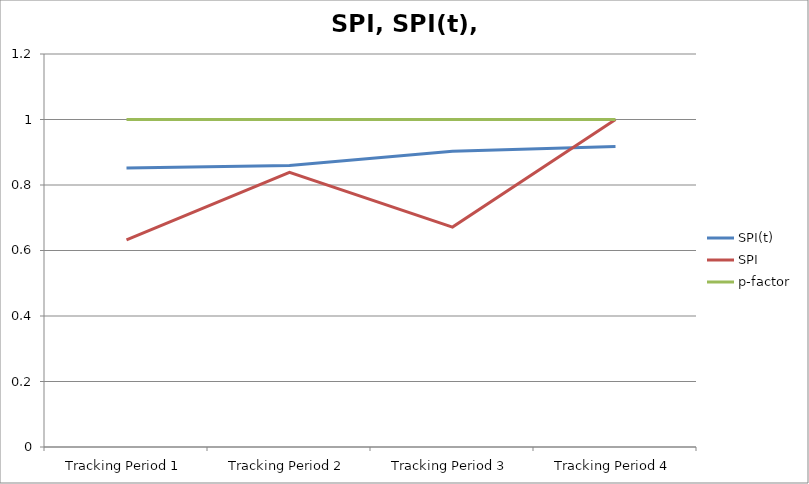
| Category | SPI(t) | SPI | p-factor |
|---|---|---|---|
| Tracking Period 1 | 0.852 | 0.632 | 1 |
| Tracking Period 2 | 0.86 | 0.839 | 1 |
| Tracking Period 3 | 0.903 | 0.671 | 1 |
| Tracking Period 4 | 0.918 | 1 | 1 |